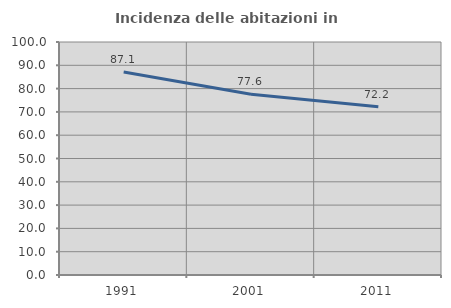
| Category | Incidenza delle abitazioni in proprietà  |
|---|---|
| 1991.0 | 87.149 |
| 2001.0 | 77.574 |
| 2011.0 | 72.227 |